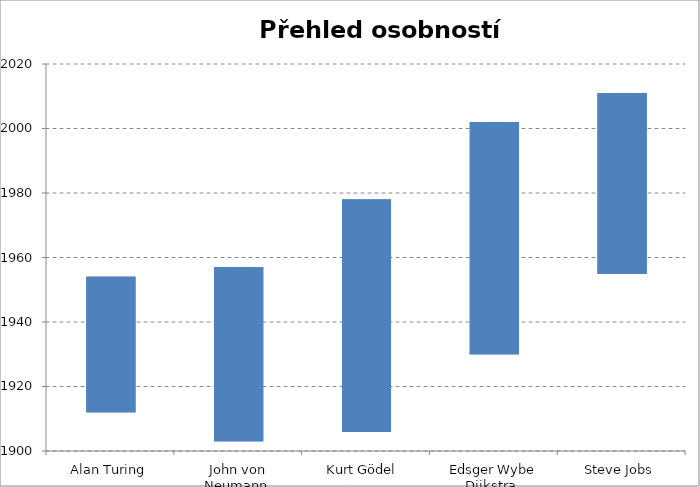
| Category | narozen | Series 1 | zemřel |
|---|---|---|---|
| Alan Turing | 1912 |  | 1954 |
| John von Neumann  | 1903 |  | 1957 |
| Kurt Gödel  | 1906 |  | 1978 |
| Edsger Wybe Dijkstra  | 1930 |  | 2002 |
| Steve Jobs | 1955 |  | 2011 |